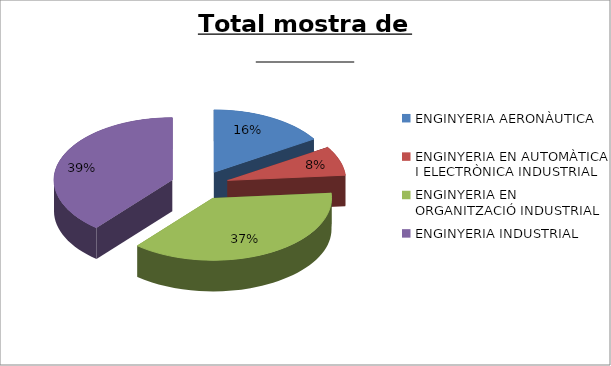
| Category | Series 0 |
|---|---|
| ENGINYERIA AERONÀUTICA | 0.16 |
| ENGINYERIA EN AUTOMÀTICA I ELECTRÒNICA INDUSTRIAL | 0.076 |
| ENGINYERIA EN ORGANITZACIÓ INDUSTRIAL | 0.374 |
| ENGINYERIA INDUSTRIAL | 0.389 |